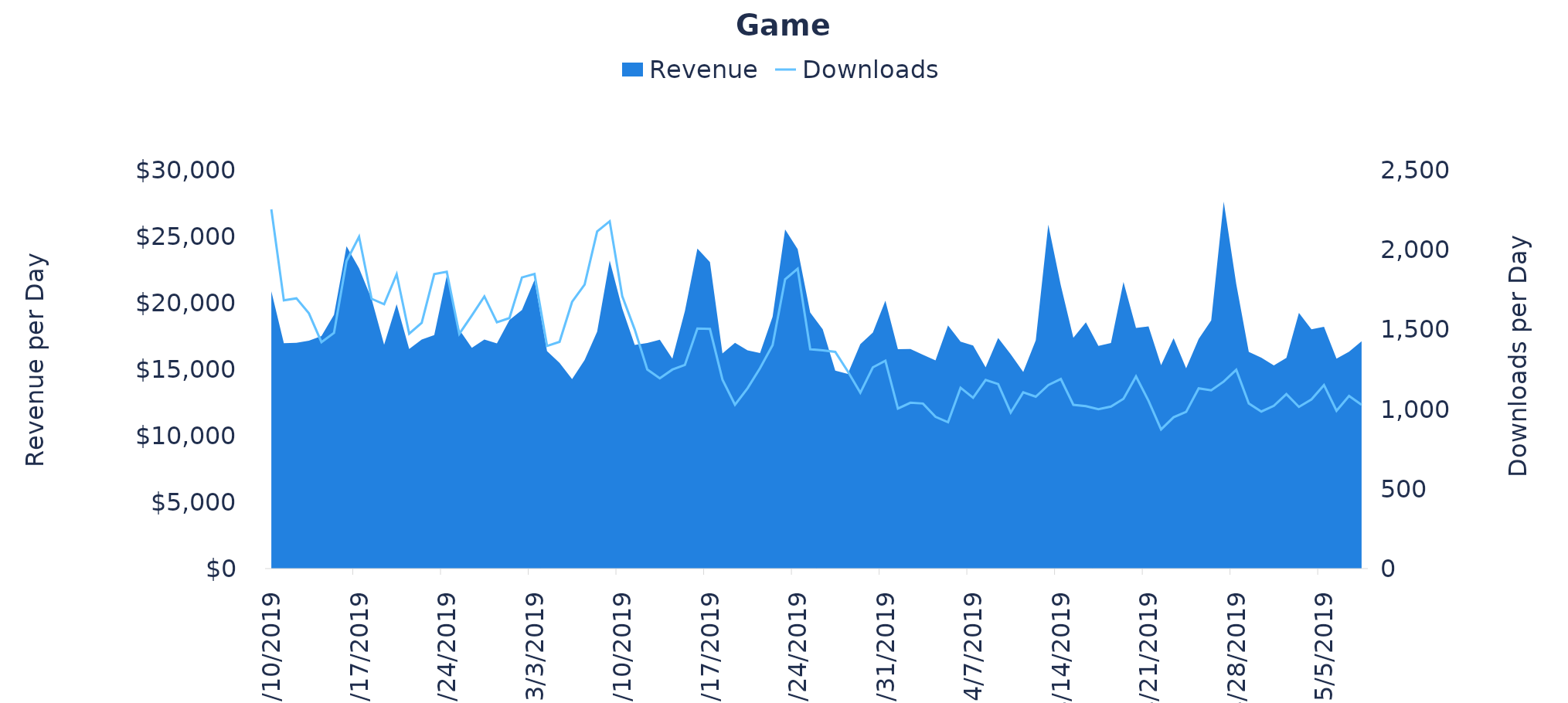
| Category | Downloads |
|---|---|
| 2/10/19 | 2253 |
| 2/11/19 | 1682 |
| 2/12/19 | 1695 |
| 2/13/19 | 1601 |
| 2/14/19 | 1420 |
| 2/15/19 | 1478 |
| 2/16/19 | 1928 |
| 2/17/19 | 2081 |
| 2/18/19 | 1692 |
| 2/19/19 | 1658 |
| 2/20/19 | 1846 |
| 2/21/19 | 1473 |
| 2/22/19 | 1541 |
| 2/23/19 | 1847 |
| 2/24/19 | 1862 |
| 2/25/19 | 1472 |
| 2/26/19 | 1587 |
| 2/27/19 | 1707 |
| 2/28/19 | 1545 |
| 3/1/19 | 1571 |
| 3/2/19 | 1826 |
| 3/3/19 | 1848 |
| 3/4/19 | 1396 |
| 3/5/19 | 1422 |
| 3/6/19 | 1673 |
| 3/7/19 | 1781 |
| 3/8/19 | 2114 |
| 3/9/19 | 2178 |
| 3/10/19 | 1709 |
| 3/11/19 | 1499 |
| 3/12/19 | 1249 |
| 3/13/19 | 1193 |
| 3/14/19 | 1248 |
| 3/15/19 | 1277 |
| 3/16/19 | 1505 |
| 3/17/19 | 1503 |
| 3/18/19 | 1185 |
| 3/19/19 | 1028 |
| 3/20/19 | 1131 |
| 3/21/19 | 1257 |
| 3/22/19 | 1401 |
| 3/23/19 | 1814 |
| 3/24/19 | 1881 |
| 3/25/19 | 1376 |
| 3/26/19 | 1369 |
| 3/27/19 | 1359 |
| 3/28/19 | 1237 |
| 3/29/19 | 1103 |
| 3/30/19 | 1262 |
| 3/31/19 | 1304 |
| 4/1/19 | 1003 |
| 4/2/19 | 1040 |
| 4/3/19 | 1035 |
| 4/4/19 | 952 |
| 4/5/19 | 918 |
| 4/6/19 | 1134 |
| 4/7/19 | 1071 |
| 4/8/19 | 1183 |
| 4/9/19 | 1157 |
| 4/10/19 | 979 |
| 4/11/19 | 1105 |
| 4/12/19 | 1078 |
| 4/13/19 | 1151 |
| 4/14/19 | 1189 |
| 4/15/19 | 1027 |
| 4/16/19 | 1019 |
| 4/17/19 | 1000 |
| 4/18/19 | 1016 |
| 4/19/19 | 1065 |
| 4/20/19 | 1205 |
| 4/21/19 | 1052 |
| 4/22/19 | 873 |
| 4/23/19 | 949 |
| 4/24/19 | 983 |
| 4/25/19 | 1130 |
| 4/26/19 | 1118 |
| 4/27/19 | 1173 |
| 4/28/19 | 1247 |
| 4/29/19 | 1036 |
| 4/30/19 | 985 |
| 5/1/19 | 1021 |
| 5/2/19 | 1094 |
| 5/3/19 | 1014 |
| 5/4/19 | 1061 |
| 5/5/19 | 1151 |
| 5/6/19 | 990 |
| 5/7/19 | 1083 |
| 5/8/19 | 1027 |